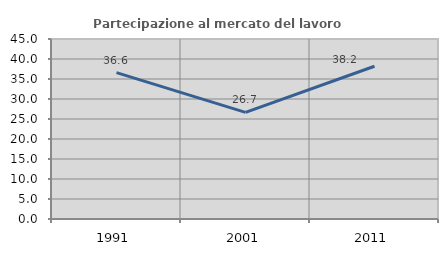
| Category | Partecipazione al mercato del lavoro  femminile |
|---|---|
| 1991.0 | 36.585 |
| 2001.0 | 26.667 |
| 2011.0 | 38.182 |